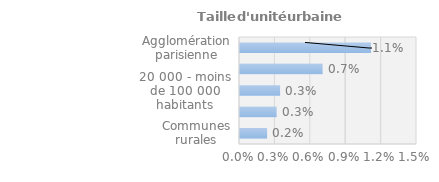
| Category | Series 0 |
|---|---|
| Communes rurales | 0.002 |
| moins de 20 000 habitants | 0.003 |
| 20 000 - moins de 100 000 habitants | 0.003 |
| 100 000 habitants ou plus | 0.007 |
| Agglomération parisienne | 0.011 |